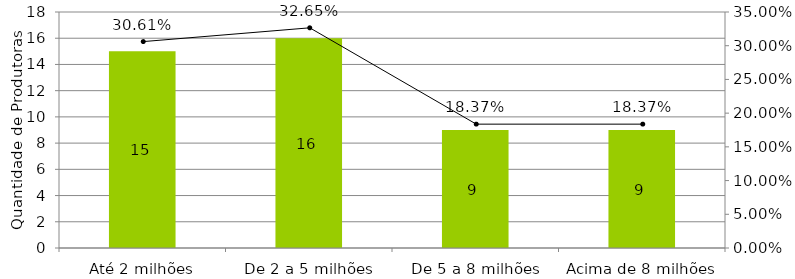
| Category | QTD de Produtoras |
|---|---|
| Até 2 milhões | 15 |
| De 2 a 5 milhões | 16 |
| De 5 a 8 milhões | 9 |
| Acima de 8 milhões | 9 |